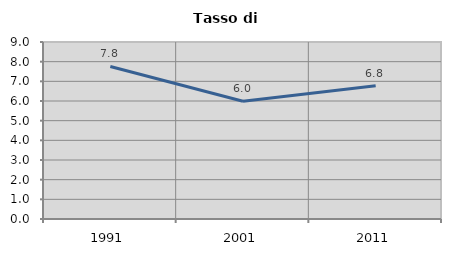
| Category | Tasso di disoccupazione   |
|---|---|
| 1991.0 | 7.756 |
| 2001.0 | 5.987 |
| 2011.0 | 6.771 |